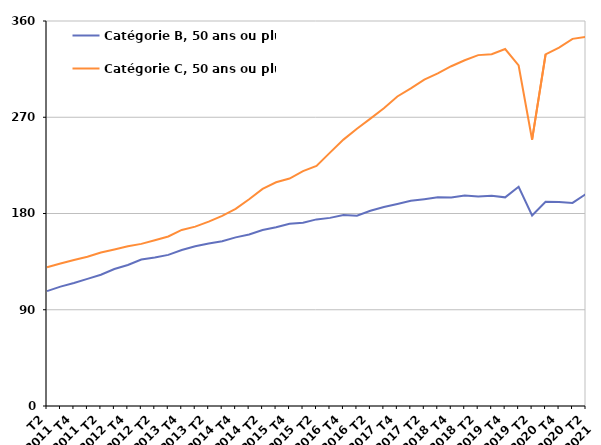
| Category | Catégorie B, 50 ans ou plus | Catégorie C, 50 ans ou plus |
|---|---|---|
| T2
2011 | 107.4 | 129.7 |
| T3
2011 | 111.6 | 133.2 |
| T4
2011 | 115 | 136.6 |
| T1
2012 | 118.9 | 139.6 |
| T2
2012 | 122.7 | 143.5 |
| T3
2012 | 128.1 | 146.4 |
| T4
2012 | 131.9 | 149.3 |
| T1
2013 | 136.9 | 151.6 |
| T2
2013 | 138.9 | 155 |
| T3
2013 | 141.3 | 158.5 |
| T4
2013 | 145.8 | 164.6 |
| T1
2014 | 149.3 | 167.7 |
| T2
2014 | 152 | 172.4 |
| T3
2014 | 154.1 | 177.8 |
| T4
2014 | 157.7 | 184.3 |
| T1
2015 | 160.3 | 193.3 |
| T2
2015 | 164.5 | 203 |
| T3
2015 | 167.1 | 209.2 |
| T4
2015 | 170.5 | 212.7 |
| T1
2016 | 171.3 | 219.6 |
| T2
2016 | 174.5 | 224.5 |
| T3
2016 | 175.9 | 236.9 |
| T4
2016 | 178.5 | 249.1 |
| T1
2017 | 178 | 259.3 |
| T2
2017 | 182.5 | 268.7 |
| T3
2017 | 186.1 | 278.4 |
| T4
2017 | 188.9 | 289.4 |
| T1
2018 | 191.9 | 297 |
| T2
2018 | 193.4 | 305.2 |
| T3
2018 | 195.1 | 311.1 |
| T4
2018 | 194.9 | 317.7 |
| T1
2019 | 196.8 | 323.3 |
| T2
2019 | 195.8 | 328.1 |
| T3
2019 | 196.5 | 328.9 |
| T4
2019 | 195.1 | 333.8 |
| T1
2020 | 205 | 318.4 |
| T2
2020 | 178.1 | 249 |
| T3
2020 | 190.9 | 328.7 |
| T4
2020 | 190.8 | 335.1 |
| T1
2021 | 189.9 | 343.3 |
| T2
2021 | 198.3 | 345.2 |